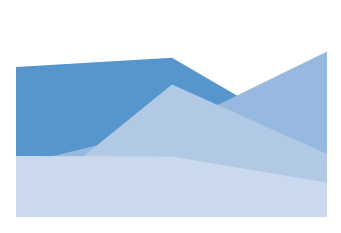
| Category | Series 0 | Series 1 | Series 2 | Series 3 | Series 4 | Series 5 | Series 6 | Series 7 |
|---|---|---|---|---|---|---|---|---|
| 0 | 0.222 | 0.814 | 0.717 | 0.886 | 0.011 | 0.308 | 0.036 | 0.36 |
| 1 | 0.647 | 0.693 | 0.456 | 0.942 | 0.302 | 0.531 | 0.783 | 0.358 |
| 2 | 0.672 | 0.427 | 0.843 | 0.404 | 0.868 | 0.981 | 0.37 | 0.201 |